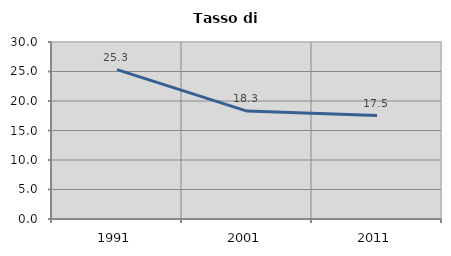
| Category | Tasso di disoccupazione   |
|---|---|
| 1991.0 | 25.33 |
| 2001.0 | 18.284 |
| 2011.0 | 17.538 |